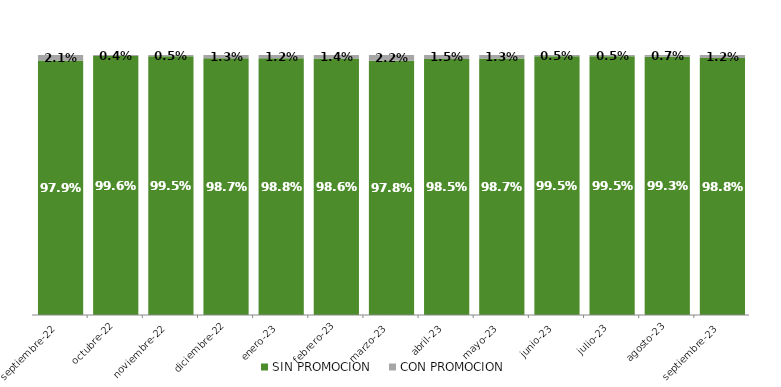
| Category | SIN PROMOCION   | CON PROMOCION   |
|---|---|---|
| 2022-09-01 | 0.979 | 0.021 |
| 2022-10-01 | 0.996 | 0.004 |
| 2022-11-01 | 0.995 | 0.005 |
| 2022-12-01 | 0.987 | 0.013 |
| 2023-01-01 | 0.988 | 0.012 |
| 2023-02-01 | 0.986 | 0.014 |
| 2023-03-01 | 0.978 | 0.022 |
| 2023-04-01 | 0.985 | 0.015 |
| 2023-05-01 | 0.987 | 0.013 |
| 2023-06-01 | 0.995 | 0.005 |
| 2023-07-01 | 0.995 | 0.005 |
| 2023-08-01 | 0.993 | 0.007 |
| 2023-09-01 | 0.988 | 0.012 |